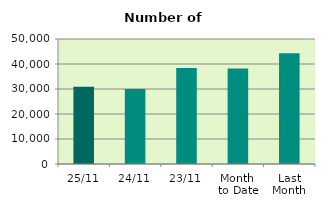
| Category | Series 0 |
|---|---|
| 25/11 | 30938 |
| 24/11 | 29974 |
| 23/11 | 38450 |
| Month 
to Date | 38150.211 |
| Last
Month | 44266.476 |